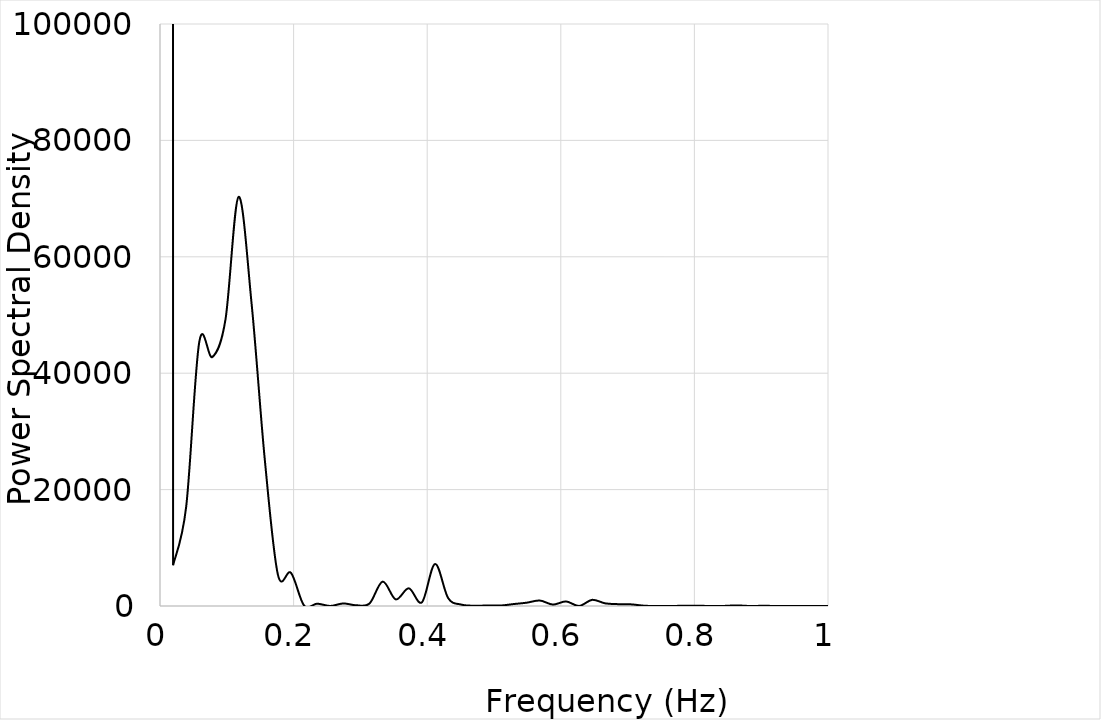
| Category | Propellant rate |
|---|---|
| 0.0 | 13864715.223 |
| 0.0196078431372549 | 7009.11 |
| 0.0392156862745098 | 17083.326 |
| 0.058823529411764705 | 45398.079 |
| 0.0784313725490196 | 42784.243 |
| 0.09803921568627451 | 49238.819 |
| 0.11764705882352941 | 70295.378 |
| 0.13725490196078433 | 51785.867 |
| 0.1568627450980392 | 25167.141 |
| 0.1764705882352941 | 5392.72 |
| 0.196078431372549 | 5699.392 |
| 0.21568627450980388 | 81.463 |
| 0.23529411764705876 | 397.62 |
| 0.25490196078431365 | 6.191 |
| 0.27450980392156854 | 439.651 |
| 0.29411764705882343 | 118.894 |
| 0.3137254901960783 | 439.179 |
| 0.3333333333333332 | 4191.875 |
| 0.3529411764705881 | 1135.513 |
| 0.372549019607843 | 3040.535 |
| 0.39215686274509787 | 643.769 |
| 0.41176470588235276 | 7216.256 |
| 0.43137254901960764 | 1355.385 |
| 0.45098039215686253 | 244.689 |
| 0.4705882352941174 | 46.207 |
| 0.4901960784313723 | 87.005 |
| 0.5098039215686272 | 77.253 |
| 0.5294117647058821 | 334.434 |
| 0.5490196078431371 | 568.75 |
| 0.568627450980392 | 940.677 |
| 0.588235294117647 | 246.681 |
| 0.6078431372549019 | 780.935 |
| 0.6274509803921569 | 10.803 |
| 0.6470588235294118 | 1055.04 |
| 0.6666666666666667 | 451.819 |
| 0.6862745098039217 | 315.524 |
| 0.7058823529411766 | 277.002 |
| 0.7254901960784316 | 41.282 |
| 0.7450980392156865 | 1.203 |
| 0.7647058823529415 | 6.315 |
| 0.7843137254901964 | 35.872 |
| 0.8039215686274513 | 29.864 |
| 0.8235294117647063 | 14.353 |
| 0.8431372549019612 | 9.597 |
| 0.8627450980392162 | 102.575 |
| 0.8823529411764711 | 5.522 |
| 0.9019607843137261 | 30.47 |
| 0.921568627450981 | 11.254 |
| 0.941176470588236 | 7.394 |
| 0.9607843137254909 | 3.759 |
| 0.9803921568627458 | 3.478 |
| 1.0000000000000007 | 1.355 |
| 1.0196078431372555 | 1.152 |
| 1.0392156862745103 | 1.612 |
| 1.0588235294117652 | 3.376 |
| 1.07843137254902 | 1.108 |
| 1.0980392156862748 | 4.504 |
| 1.1176470588235297 | 62.209 |
| 1.1372549019607845 | 281.798 |
| 1.1568627450980393 | 22.411 |
| 1.1764705882352942 | 2.112 |
| 1.196078431372549 | 16.982 |
| 1.2156862745098038 | 3.716 |
| 1.2352941176470587 | 1.626 |
| 1.2549019607843135 | 6.915 |
| 1.2745098039215683 | 0.797 |
| 1.2941176470588232 | 1.426 |
| 1.313725490196078 | 139.656 |
| 1.3333333333333328 | 92.184 |
| 1.3529411764705876 | 47.304 |
| 1.3725490196078425 | 101.814 |
| 1.3921568627450973 | 61.908 |
| 1.4117647058823521 | 190.732 |
| 1.431372549019607 | 1.982 |
| 1.4509803921568618 | 96.895 |
| 1.4705882352941166 | 127.712 |
| 1.4901960784313715 | 7.766 |
| 1.5098039215686263 | 15.994 |
| 1.5294117647058811 | 22.933 |
| 1.549019607843136 | 7.169 |
| 1.5686274509803908 | 100.991 |
| 1.5882352941176456 | 16.064 |
| 1.6078431372549005 | 46.438 |
| 1.6274509803921553 | 111.642 |
| 1.6470588235294101 | 140.835 |
| 1.666666666666665 | 20.247 |
| 1.6862745098039198 | 20.859 |
| 1.7058823529411746 | 26.155 |
| 1.7254901960784295 | 15.987 |
| 1.7450980392156843 | 7.235 |
| 1.7647058823529391 | 2.65 |
| 1.784313725490194 | 2.254 |
| 1.8039215686274488 | 8.452 |
| 1.8235294117647036 | 12.313 |
| 1.8431372549019585 | 0.55 |
| 1.8627450980392133 | 4.047 |
| 1.8823529411764681 | 8.726 |
| 1.901960784313723 | 23.412 |
| 1.9215686274509778 | 0.32 |
| 1.9411764705882326 | 4.367 |
| 1.9607843137254874 | 0.19 |
| 1.9803921568627423 | 1.162 |
| 1.9999999999999971 | 0.508 |
| 2.019607843137252 | 0.412 |
| 2.039215686274507 | 0.594 |
| 2.058823529411762 | 0.956 |
| 2.0784313725490167 | 1.778 |
| 2.0980392156862715 | 1.903 |
| 2.1176470588235263 | 29.266 |
| 2.137254901960781 | 2.286 |
| 2.156862745098036 | 70.336 |
| 2.176470588235291 | 63.095 |
| 2.1960784313725457 | 4.675 |
| 2.2156862745098005 | 3.819 |
| 2.2352941176470553 | 4.947 |
| 2.25490196078431 | 2.001 |
| 2.274509803921565 | 2.771 |
| 2.29411764705882 | 30.863 |
| 2.3137254901960747 | 26.958 |
| 2.3333333333333295 | 88.22 |
| 2.3529411764705843 | 82.095 |
| 2.372549019607839 | 9.642 |
| 2.392156862745094 | 81.667 |
| 2.411764705882349 | 131.829 |
| 2.4313725490196036 | 80.99 |
| 2.4509803921568585 | 71.859 |
| 2.4705882352941133 | 48.517 |
| 2.490196078431368 | 17.128 |
| 2.509803921568623 | 1.384 |
| 2.529411764705878 | 17.128 |
| 2.5490196078431326 | 48.517 |
| 2.5686274509803875 | 71.859 |
| 2.5882352941176423 | 80.99 |
| 2.607843137254897 | 131.829 |
| 2.627450980392152 | 81.667 |
| 2.647058823529407 | 9.642 |
| 2.6666666666666616 | 82.095 |
| 2.6862745098039165 | 88.22 |
| 2.7058823529411713 | 26.958 |
| 2.725490196078426 | 30.863 |
| 2.745098039215681 | 2.771 |
| 2.764705882352936 | 2.001 |
| 2.7843137254901906 | 4.947 |
| 2.8039215686274455 | 3.819 |
| 2.8235294117647003 | 4.675 |
| 2.843137254901955 | 63.095 |
| 2.86274509803921 | 70.336 |
| 2.882352941176465 | 2.286 |
| 2.9019607843137196 | 29.266 |
| 2.9215686274509745 | 1.903 |
| 2.9411764705882293 | 1.778 |
| 2.960784313725484 | 0.956 |
| 2.980392156862739 | 0.594 |
| 2.999999999999994 | 0.412 |
| 3.0196078431372486 | 0.508 |
| 3.0392156862745034 | 1.162 |
| 3.0588235294117583 | 0.19 |
| 3.078431372549013 | 4.367 |
| 3.098039215686268 | 0.32 |
| 3.1176470588235228 | 23.412 |
| 3.1372549019607776 | 8.726 |
| 3.1568627450980324 | 4.047 |
| 3.1764705882352873 | 0.55 |
| 3.196078431372542 | 12.313 |
| 3.215686274509797 | 8.452 |
| 3.2352941176470518 | 2.254 |
| 3.2549019607843066 | 2.65 |
| 3.2745098039215614 | 7.235 |
| 3.2941176470588163 | 15.987 |
| 3.313725490196071 | 26.155 |
| 3.333333333333326 | 20.859 |
| 3.3529411764705808 | 20.247 |
| 3.3725490196078356 | 140.835 |
| 3.3921568627450904 | 111.642 |
| 3.4117647058823453 | 46.438 |
| 3.4313725490196 | 16.064 |
| 3.450980392156855 | 100.991 |
| 3.4705882352941098 | 7.169 |
| 3.4901960784313646 | 22.933 |
| 3.5098039215686194 | 15.994 |
| 3.5294117647058743 | 7.766 |
| 3.549019607843129 | 127.712 |
| 3.568627450980384 | 96.895 |
| 3.5882352941176388 | 1.982 |
| 3.6078431372548936 | 190.732 |
| 3.6274509803921484 | 61.908 |
| 3.6470588235294032 | 101.814 |
| 3.666666666666658 | 47.304 |
| 3.686274509803913 | 92.184 |
| 3.7058823529411677 | 139.656 |
| 3.7254901960784226 | 1.426 |
| 3.7450980392156774 | 0.797 |
| 3.7647058823529322 | 6.915 |
| 3.784313725490187 | 1.626 |
| 3.803921568627442 | 3.716 |
| 3.8235294117646967 | 16.982 |
| 3.8431372549019516 | 2.112 |
| 3.8627450980392064 | 22.411 |
| 3.8823529411764612 | 281.798 |
| 3.901960784313716 | 62.209 |
| 3.921568627450971 | 4.504 |
| 3.9411764705882257 | 1.108 |
| 3.9607843137254806 | 3.376 |
| 3.9803921568627354 | 1.612 |
| 3.9999999999999902 | 1.152 |
| 4.019607843137245 | 1.355 |
| 4.0392156862745 | 3.478 |
| 4.058823529411755 | 3.759 |
| 4.07843137254901 | 7.394 |
| 4.098039215686264 | 11.254 |
| 4.117647058823519 | 30.47 |
| 4.137254901960774 | 5.522 |
| 4.156862745098029 | 102.575 |
| 4.176470588235284 | 9.597 |
| 4.1960784313725386 | 14.353 |
| 4.215686274509793 | 29.864 |
| 4.235294117647048 | 35.872 |
| 4.254901960784303 | 6.315 |
| 4.274509803921558 | 1.203 |
| 4.294117647058813 | 41.282 |
| 4.3137254901960675 | 277.002 |
| 4.333333333333322 | 315.524 |
| 4.352941176470577 | 451.819 |
| 4.372549019607832 | 1055.04 |
| 4.392156862745087 | 10.803 |
| 4.411764705882342 | 780.935 |
| 4.4313725490195965 | 246.681 |
| 4.450980392156851 | 940.677 |
| 4.470588235294106 | 568.75 |
| 4.490196078431361 | 334.434 |
| 4.509803921568616 | 77.253 |
| 4.529411764705871 | 87.005 |
| 4.5490196078431255 | 46.207 |
| 4.56862745098038 | 244.689 |
| 4.588235294117635 | 1355.385 |
| 4.60784313725489 | 7216.256 |
| 4.627450980392145 | 643.769 |
| 4.6470588235294 | 3040.535 |
| 4.6666666666666545 | 1135.513 |
| 4.686274509803909 | 4191.875 |
| 4.705882352941164 | 439.179 |
| 4.725490196078419 | 118.894 |
| 4.745098039215674 | 439.651 |
| 4.764705882352929 | 6.191 |
| 4.7843137254901835 | 397.62 |
| 4.803921568627438 | 81.463 |
| 4.823529411764693 | 5699.392 |
| 4.843137254901948 | 5392.72 |
| 4.862745098039203 | 25167.141 |
| 4.882352941176458 | 51785.867 |
| 4.9019607843137125 | 70295.378 |
| 4.921568627450967 | 49238.819 |
| 4.941176470588222 | 42784.243 |
| 4.960784313725477 | 45398.079 |
| 4.980392156862732 | 17083.326 |
| 4.999999999999987 | 7009.11 |